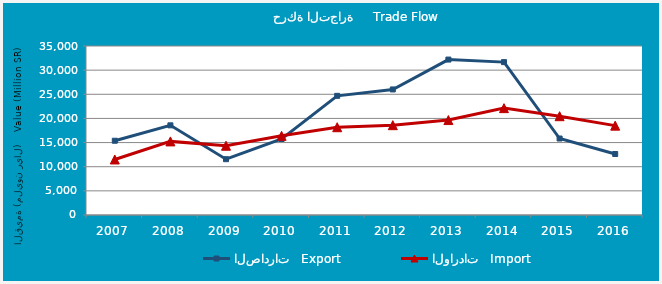
| Category | الصادرات   Export | الواردات   Import |
|---|---|---|
| 2007.0 | 15379.767 | 11498.766 |
| 2008.0 | 18568.012 | 15244.218 |
| 2009.0 | 11557.1 | 14346.127 |
| 2010.0 | 15739.414 | 16394.735 |
| 2011.0 | 24678.839 | 18178.156 |
| 2012.0 | 26001.7 | 18603.067 |
| 2013.0 | 32190.633 | 19662.716 |
| 2014.0 | 31662.286 | 22132.199 |
| 2015.0 | 15836.775 | 20462.341 |
| 2016.0 | 12634.666 | 18507.197 |